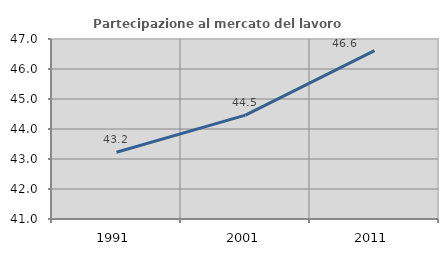
| Category | Partecipazione al mercato del lavoro  femminile |
|---|---|
| 1991.0 | 43.225 |
| 2001.0 | 44.462 |
| 2011.0 | 46.612 |